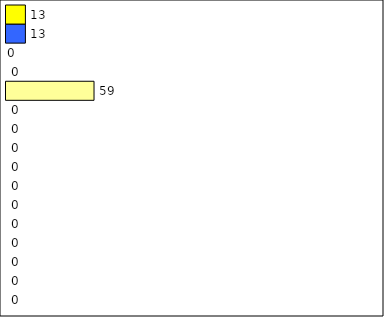
| Category | -2 | -1 | 0 | 1 | 2 | 3 | 4 | 5 | 6 | 7 | 8 | 9 | 10 | 11 | 12 | Perfect Round |
|---|---|---|---|---|---|---|---|---|---|---|---|---|---|---|---|---|
| 0 | 0 | 0 | 0 | 0 | 0 | 0 | 0 | 0 | 0 | 0 | 0 | 59 | 0 | 0 | 13 | 13 |